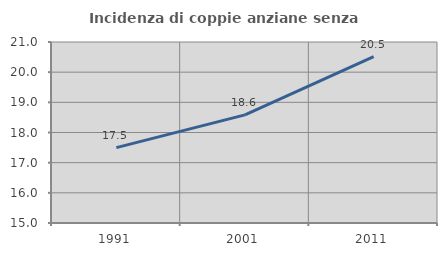
| Category | Incidenza di coppie anziane senza figli  |
|---|---|
| 1991.0 | 17.5 |
| 2001.0 | 18.584 |
| 2011.0 | 20.513 |